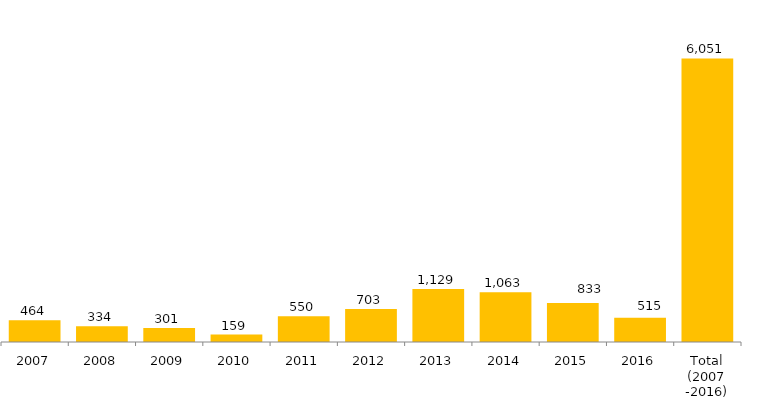
| Category | Total Geral |
|---|---|
| 2007 | 464 |
| 2008 | 334 |
| 2009 | 301 |
| 2010 | 159 |
| 2011 | 550 |
| 2012 | 703 |
| 2013 | 1129 |
| 2014 | 1063 |
| 2015 | 833 |
| 2016 | 515 |
| Total (2007 -2016) | 6051 |